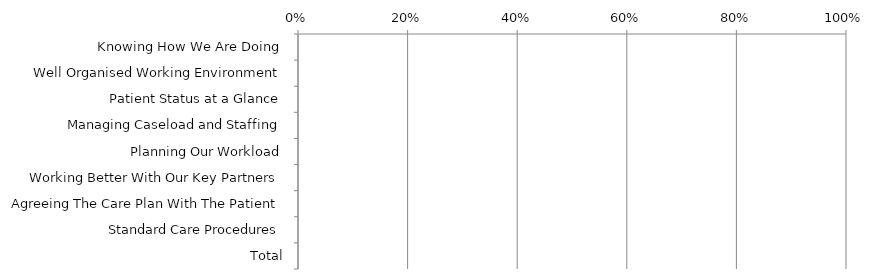
| Category | Yes | No |
|---|---|---|
| Knowing How We Are Doing | 0 | 0 |
| Well Organised Working Environment | 0 | 0 |
| Patient Status at a Glance | 0 | 0 |
| Managing Caseload and Staffing | 0 | 0 |
| Planning Our Workload | 0 | 0 |
| Working Better With Our Key Partners | 0 | 0 |
| Agreeing The Care Plan With The Patient | 0 | 0 |
| Standard Care Procedures | 0 | 0 |
| Total | 0 | 0 |